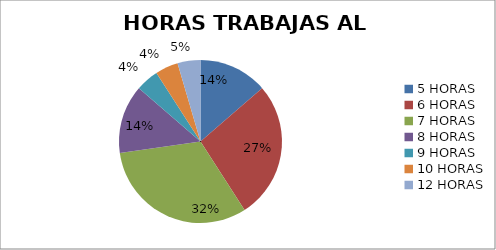
| Category | Series 0 |
|---|---|
| 5 HORAS | 3 |
| 6 HORAS | 6 |
| 7 HORAS | 7 |
| 8 HORAS | 3 |
| 9 HORAS | 1 |
| 10 HORAS | 1 |
| 12 HORAS | 1 |